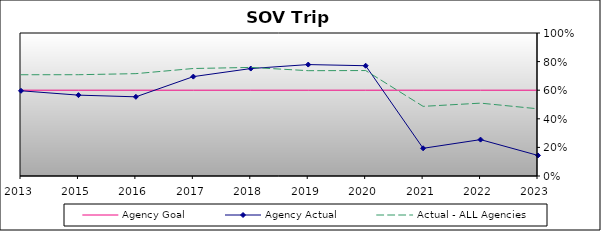
| Category | Agency Goal | Agency Actual | Actual - ALL Agencies |
|---|---|---|---|
| 2013.0 | 0.6 | 0.596 | 0.708 |
| 2015.0 | 0.6 | 0.566 | 0.708 |
| 2016.0 | 0.6 | 0.554 | 0.716 |
| 2017.0 | 0.6 | 0.695 | 0.752 |
| 2018.0 | 0.6 | 0.751 | 0.759 |
| 2019.0 | 0.6 | 0.779 | 0.736 |
| 2020.0 | 0.6 | 0.771 | 0.737 |
| 2021.0 | 0.6 | 0.194 | 0.487 |
| 2022.0 | 0.6 | 0.254 | 0.509 |
| 2023.0 | 0.6 | 0.144 | 0.47 |